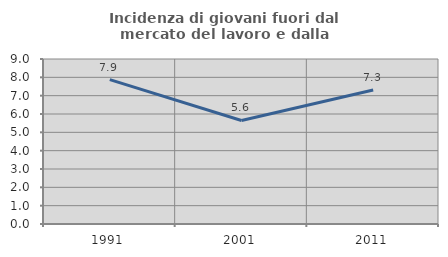
| Category | Incidenza di giovani fuori dal mercato del lavoro e dalla formazione  |
|---|---|
| 1991.0 | 7.871 |
| 2001.0 | 5.648 |
| 2011.0 | 7.311 |